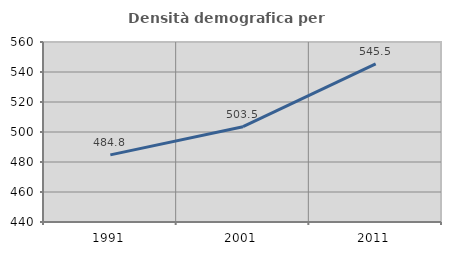
| Category | Densità demografica |
|---|---|
| 1991.0 | 484.769 |
| 2001.0 | 503.527 |
| 2011.0 | 545.466 |